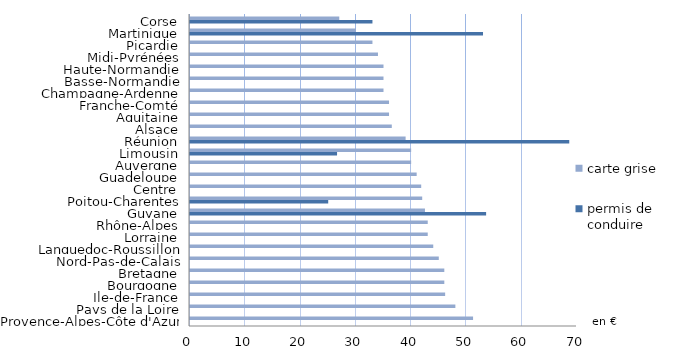
| Category | permis de conduire | carte grise |
|---|---|---|
| Provence-Alpes-Côte d'Azur | 0 | 51.2 |
| Pays de la Loire | 0 | 48 |
| Ile-de-France | 0 | 46.15 |
| Bourgogne | 0 | 46 |
| Bretagne | 0 | 46 |
| Nord-Pas-de-Calais | 0 | 45 |
| Languedoc-Roussillon | 0 | 44 |
| Lorraine | 0 | 43 |
| Rhône-Alpes | 0 | 43 |
| Guyane | 53.56 | 42.5 |
| Poitou-Charentes | 25 | 42 |
| Centre | 0 | 41.82 |
| Guadeloupe | 0 | 41 |
| Auvergne | 0 | 40 |
| Limousin | 26.6 | 40 |
| Réunion | 68.6 | 39 |
| Alsace | 0 | 36.5 |
| Aquitaine | 0 | 36 |
| Franche-Comté | 0 | 36 |
| Champagne-Ardenne | 0 | 35 |
| Basse-Normandie | 0 | 35 |
| Haute-Normandie | 0 | 35 |
| Midi-Pyrénées | 0 | 34 |
| Picardie | 0 | 33 |
| Martinique | 53 | 30 |
| Corse | 33 | 27 |